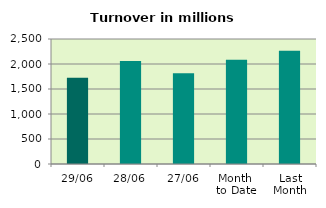
| Category | Series 0 |
|---|---|
| 29/06 | 1722.573 |
| 28/06 | 2061.486 |
| 27/06 | 1814.908 |
| Month 
to Date | 2085.993 |
| Last
Month | 2265.206 |